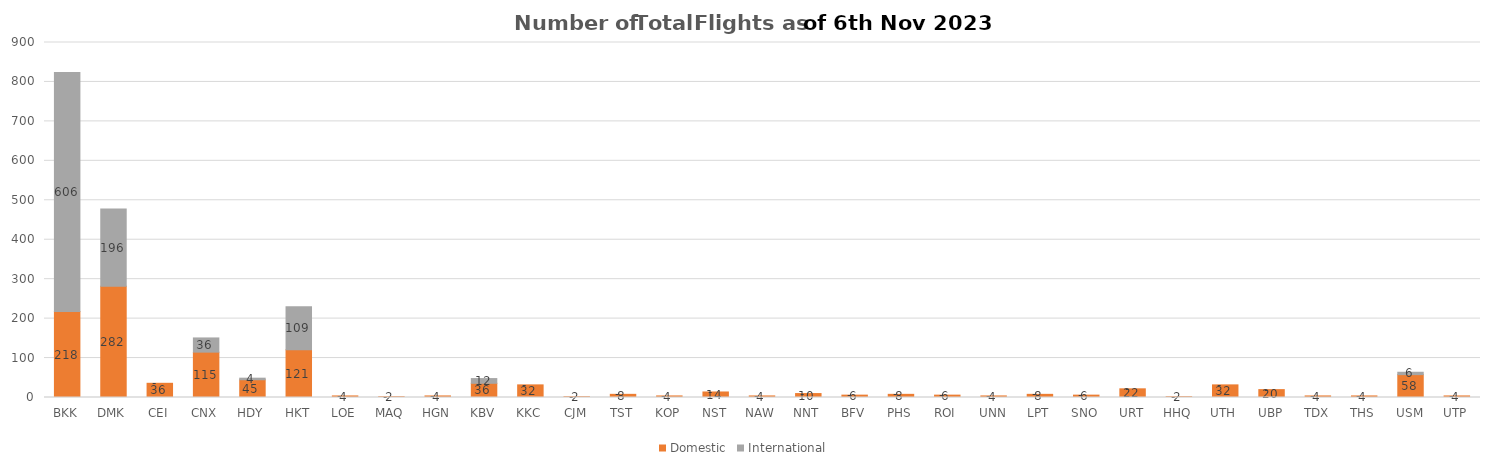
| Category | Domestic | International |
|---|---|---|
| BKK | 218 | 606 |
| DMK | 282 | 196 |
| CEI | 36 | 0 |
| CNX | 115 | 36 |
| HDY | 45 | 4 |
| HKT | 121 | 109 |
| LOE | 4 | 0 |
| MAQ | 2 | 0 |
| HGN | 4 | 0 |
| KBV | 36 | 12 |
| KKC | 32 | 0 |
| CJM | 2 | 0 |
| TST | 8 | 0 |
| KOP | 4 | 0 |
| NST | 14 | 0 |
| NAW | 4 | 0 |
| NNT | 10 | 0 |
| BFV | 6 | 0 |
| PHS | 8 | 0 |
| ROI | 6 | 0 |
| UNN | 4 | 0 |
| LPT | 8 | 0 |
| SNO | 6 | 0 |
| URT | 22 | 0 |
| HHQ | 2 | 0 |
| UTH | 32 | 0 |
| UBP | 20 | 0 |
| TDX | 4 | 0 |
| THS | 4 | 0 |
| USM | 58 | 6 |
| UTP | 4 | 0 |